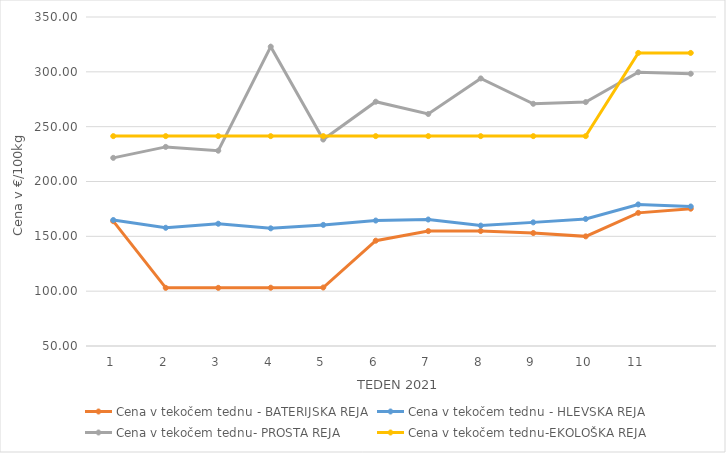
| Category | Cena v tekočem tednu - BATERIJSKA REJA | Cena v tekočem tednu - HLEVSKA REJA | Cena v tekočem tednu- PROSTA REJA | Cena v tekočem tednu-EKOLOŠKA REJA |
|---|---|---|---|---|
| 1.0 | 163.81 | 164.86 | 221.55 | 241.38 |
| 2.0 | 103.02 | 157.81 | 231.55 | 241.38 |
| 3.0 | 103.03 | 161.48 | 228.1 | 241.38 |
| 4.0 | 103.15 | 157.29 | 322.93 | 241.38 |
| 5.0 | 103.34 | 160.43 | 238.28 | 241.38 |
| 6.0 | 146.03 | 164.39 | 272.76 | 241.38 |
| 7.0 | 154.77 | 165.34 | 261.55 | 241.38 |
| 8.0 | 154.86 | 159.79 | 293.97 | 241.38 |
| 9.0 | 153 | 162.73 | 270.86 | 241.38 |
| 10.0 | 149.98 | 165.85 | 272.41 | 241.38 |
| 11.0 | 171.4 | 179.09 | 299.66 | 317.24 |